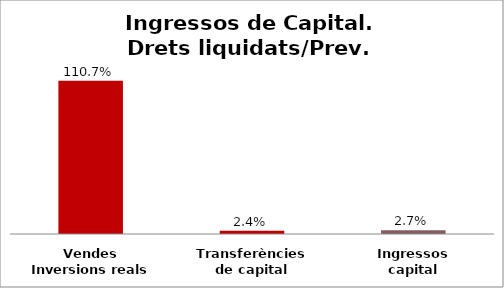
| Category | Series 0 |
|---|---|
| Vendes Inversions reals | 1.107 |
| Transferències de capital | 0.024 |
| Ingressos capital | 0.027 |